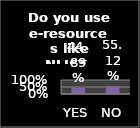
| Category | Series 0 |
|---|---|
| YES | 0.449 |
| NO | 0.551 |